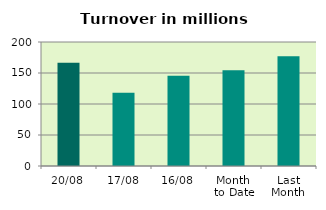
| Category | Series 0 |
|---|---|
| 20/08 | 166.499 |
| 17/08 | 118.182 |
| 16/08 | 145.751 |
| Month 
to Date | 154.428 |
| Last
Month | 177.022 |